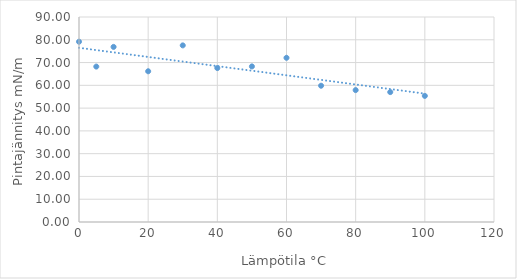
| Category | Series 0 |
|---|---|
| 0.0 | 79.153 |
| 5.0 | 68.234 |
| 10.0 | 76.871 |
| 20.0 | 66.175 |
| 30.0 | 77.537 |
| 40.0 | 67.582 |
| 50.0 | 68.307 |
| 60.0 | 72.092 |
| 70.0 | 59.828 |
| 80.0 | 57.905 |
| 90.0 | 57.03 |
| 100.0 | 55.366 |